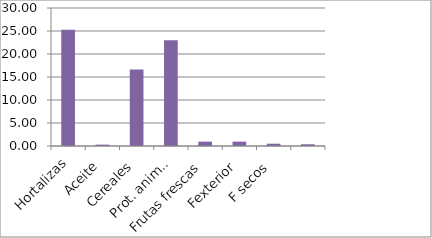
| Category | Series 0 |
|---|---|
| Hortalizas | 25.247 |
| Aceite | 0.3 |
| Cereales | 16.642 |
| Prot. animal | 23.004 |
| Frutas frescas | 0.946 |
| Fexterior | 0.946 |
|      F secos | 0.497 |